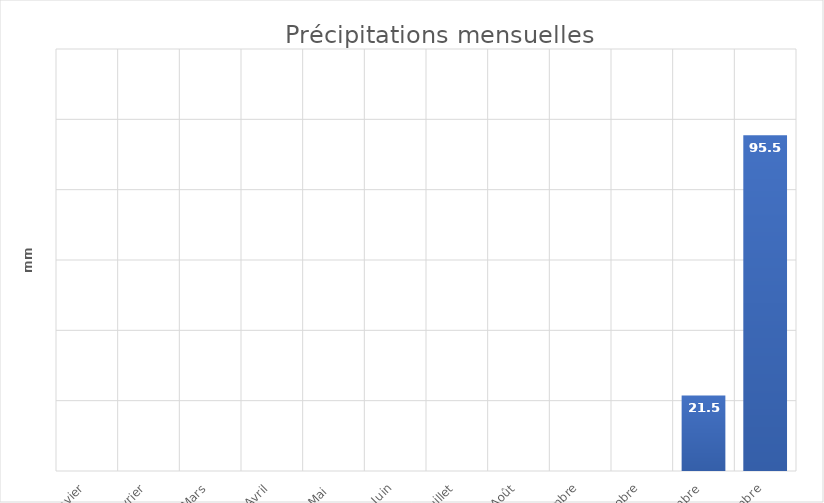
| Category | Series 0 |
|---|---|
| Janvier | 0 |
| Février | 0 |
| Mars | 0 |
| Avril | 0 |
| Mai  | 0 |
| Juin | 0 |
| Juillet | 0 |
| Août | 0 |
| Septembre | 0 |
| Octobre | 0 |
| Novembre | 21.5 |
| Décembre | 95.5 |